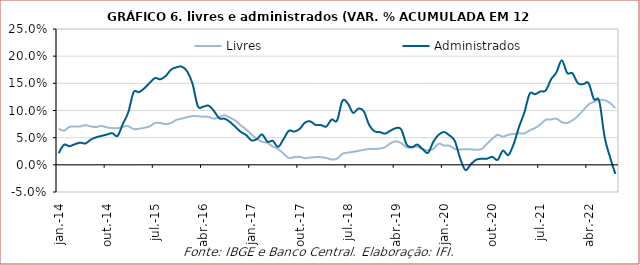
| Category | Livres | Administrados |
|---|---|---|
| 2014-01-01 | 0.066 | 0.021 |
| 2014-02-01 | 0.063 | 0.037 |
| 2014-03-01 | 0.07 | 0.034 |
| 2014-04-01 | 0.07 | 0.038 |
| 2014-05-01 | 0.071 | 0.041 |
| 2014-06-01 | 0.073 | 0.039 |
| 2014-07-01 | 0.071 | 0.046 |
| 2014-08-01 | 0.069 | 0.051 |
| 2014-09-01 | 0.072 | 0.053 |
| 2014-10-01 | 0.069 | 0.056 |
| 2014-11-01 | 0.068 | 0.058 |
| 2014-12-01 | 0.067 | 0.053 |
| 2015-01-01 | 0.07 | 0.075 |
| 2015-02-01 | 0.071 | 0.097 |
| 2015-03-01 | 0.066 | 0.134 |
| 2015-04-01 | 0.066 | 0.134 |
| 2015-05-01 | 0.068 | 0.141 |
| 2015-06-01 | 0.071 | 0.151 |
| 2015-07-01 | 0.077 | 0.16 |
| 2015-08-01 | 0.077 | 0.158 |
| 2015-09-01 | 0.075 | 0.164 |
| 2015-10-01 | 0.077 | 0.175 |
| 2015-11-01 | 0.083 | 0.18 |
| 2015-12-01 | 0.085 | 0.181 |
| 2016-01-01 | 0.088 | 0.172 |
| 2016-02-01 | 0.09 | 0.149 |
| 2016-03-01 | 0.09 | 0.108 |
| 2016-04-01 | 0.088 | 0.107 |
| 2016-05-01 | 0.088 | 0.109 |
| 2016-06-01 | 0.085 | 0.099 |
| 2016-07-01 | 0.088 | 0.086 |
| 2016-08-01 | 0.091 | 0.085 |
| 2016-09-01 | 0.087 | 0.079 |
| 2016-10-01 | 0.082 | 0.07 |
| 2016-11-01 | 0.073 | 0.061 |
| 2016-12-01 | 0.065 | 0.055 |
| 2017-01-01 | 0.056 | 0.045 |
| 2017-02-01 | 0.048 | 0.047 |
| 2017-03-01 | 0.043 | 0.056 |
| 2017-04-01 | 0.041 | 0.042 |
| 2017-05-01 | 0.034 | 0.044 |
| 2017-06-01 | 0.029 | 0.033 |
| 2017-07-01 | 0.021 | 0.047 |
| 2017-08-01 | 0.013 | 0.063 |
| 2017-09-01 | 0.014 | 0.061 |
| 2017-10-01 | 0.015 | 0.066 |
| 2017-11-01 | 0.012 | 0.078 |
| 2017-12-01 | 0.013 | 0.08 |
| 2018-01-01 | 0.014 | 0.074 |
| 2018-02-01 | 0.014 | 0.073 |
| 2018-03-01 | 0.013 | 0.071 |
| 2018-04-01 | 0.01 | 0.083 |
| 2018-05-01 | 0.011 | 0.081 |
| 2018-06-01 | 0.02 | 0.118 |
| 2018-07-01 | 0.022 | 0.113 |
| 2018-08-01 | 0.024 | 0.096 |
| 2018-09-01 | 0.026 | 0.104 |
| 2018-10-01 | 0.028 | 0.099 |
| 2018-11-01 | 0.029 | 0.074 |
| 2018-12-01 | 0.029 | 0.062 |
| 2019-01-01 | 0.03 | 0.06 |
| 2019-02-01 | 0.033 | 0.057 |
| 2019-03-01 | 0.04 | 0.063 |
| 2019-04-01 | 0.043 | 0.068 |
| 2019-05-01 | 0.04 | 0.065 |
| 2019-06-01 | 0.032 | 0.037 |
| 2019-07-01 | 0.032 | 0.032 |
| 2019-08-01 | 0.033 | 0.037 |
| 2019-09-01 | 0.029 | 0.029 |
| 2019-10-01 | 0.027 | 0.022 |
| 2019-11-01 | 0.029 | 0.042 |
| 2019-12-01 | 0.039 | 0.055 |
| 2020-01-01 | 0.036 | 0.06 |
| 2020-02-01 | 0.035 | 0.054 |
| 2020-03-01 | 0.029 | 0.044 |
| 2020-04-01 | 0.028 | 0.012 |
| 2020-05-01 | 0.029 | -0.01 |
| 2020-06-01 | 0.028 | 0.001 |
| 2020-07-01 | 0.028 | 0.009 |
| 2020-08-01 | 0.029 | 0.011 |
| 2020-09-01 | 0.038 | 0.011 |
| 2020-10-01 | 0.048 | 0.015 |
| 2020-11-01 | 0.055 | 0.009 |
| 2020-12-01 | 0.052 | 0.026 |
| 2021-01-01 | 0.055 | 0.018 |
| 2021-02-01 | 0.057 | 0.038 |
| 2021-03-01 | 0.058 | 0.07 |
| 2021-04-01 | 0.058 | 0.096 |
| 2021-05-01 | 0.063 | 0.131 |
| 2021-06-01 | 0.068 | 0.13 |
| 2021-07-01 | 0.074 | 0.135 |
| 2021-08-01 | 0.083 | 0.137 |
| 2021-09-01 | 0.084 | 0.157 |
| 2021-10-01 | 0.085 | 0.17 |
| 2021-11-01 | 0.078 | 0.192 |
| 2021-12-01 | 0.077 | 0.169 |
| 2022-01-01 | 0.082 | 0.168 |
| 2022-02-01 | 0.09 | 0.15 |
| 2022-03-01 | 0.1 | 0.149 |
| 2022-04-01 | 0.111 | 0.15 |
| 2022-05-01 | 0.116 | 0.121 |
| 2022-06-01 | 0.119 | 0.117 |
| 2022-07-01 | 0.119 | 0.051 |
| 2022-08-01 | 0.114 | 0.015 |
| 2022-09-01 | 0.104 | -0.017 |